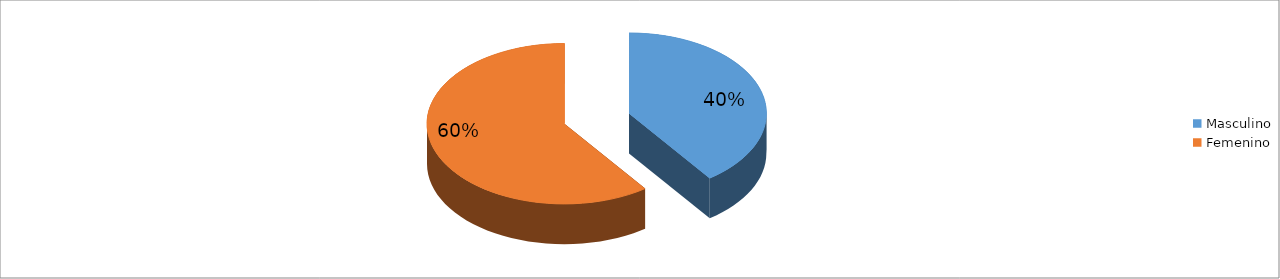
| Category | Series 0 |
|---|---|
| Masculino | 0.4 |
| Femenino | 0.6 |